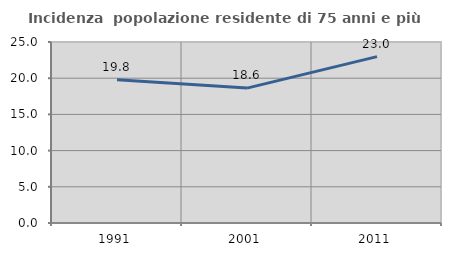
| Category | Incidenza  popolazione residente di 75 anni e più |
|---|---|
| 1991.0 | 19.799 |
| 2001.0 | 18.632 |
| 2011.0 | 22.983 |